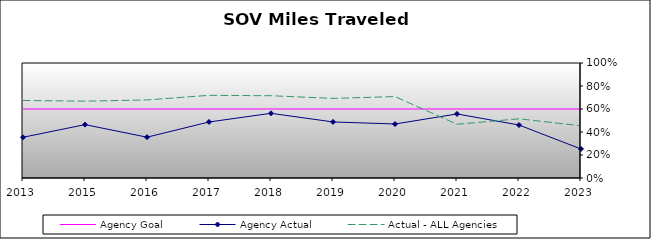
| Category | Agency Goal | Agency Actual | Actual - ALL Agencies |
|---|---|---|---|
| 2013.0 | 0.6 | 0.354 | 0.674 |
| 2015.0 | 0.6 | 0.464 | 0.668 |
| 2016.0 | 0.6 | 0.355 | 0.679 |
| 2017.0 | 0.6 | 0.487 | 0.719 |
| 2018.0 | 0.6 | 0.563 | 0.715 |
| 2019.0 | 0.6 | 0.488 | 0.692 |
| 2020.0 | 0.6 | 0.47 | 0.708 |
| 2021.0 | 0.6 | 0.557 | 0.467 |
| 2022.0 | 0.6 | 0.461 | 0.515 |
| 2023.0 | 0.6 | 0.252 | 0.454 |